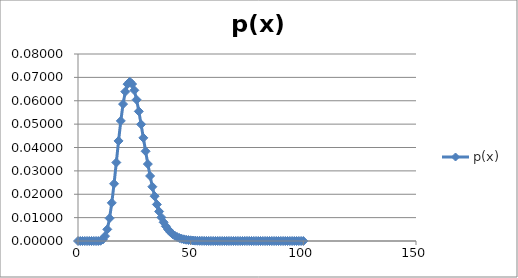
| Category | p(x) |
|---|---|
| 0.0 | 0 |
| 1.0 | 0 |
| 2.0 | 0 |
| 3.0 | 0 |
| 4.0 | 0 |
| 5.0 | 0 |
| 6.0 | 0 |
| 7.0 | 0 |
| 8.0 | 0 |
| 9.0 | 0 |
| 10.0 | 0 |
| 11.0 | 0.001 |
| 12.0 | 0.002 |
| 13.0 | 0.005 |
| 14.0 | 0.01 |
| 15.0 | 0.016 |
| 16.0 | 0.024 |
| 17.0 | 0.034 |
| 18.0 | 0.043 |
| 19.0 | 0.051 |
| 20.0 | 0.059 |
| 21.0 | 0.064 |
| 22.0 | 0.067 |
| 23.0 | 0.068 |
| 24.0 | 0.067 |
| 25.0 | 0.064 |
| 26.0 | 0.06 |
| 27.0 | 0.055 |
| 28.0 | 0.05 |
| 29.0 | 0.044 |
| 30.0 | 0.038 |
| 31.0 | 0.033 |
| 32.0 | 0.028 |
| 33.0 | 0.023 |
| 34.0 | 0.019 |
| 35.0 | 0.016 |
| 36.0 | 0.013 |
| 37.0 | 0.01 |
| 38.0 | 0.008 |
| 39.0 | 0.006 |
| 40.0 | 0.005 |
| 41.0 | 0.004 |
| 42.0 | 0.003 |
| 43.0 | 0.002 |
| 44.0 | 0.002 |
| 45.0 | 0.001 |
| 46.0 | 0.001 |
| 47.0 | 0.001 |
| 48.0 | 0.001 |
| 49.0 | 0 |
| 50.0 | 0 |
| 51.0 | 0 |
| 52.0 | 0 |
| 53.0 | 0 |
| 54.0 | 0 |
| 55.0 | 0 |
| 56.0 | 0 |
| 57.0 | 0 |
| 58.0 | 0 |
| 59.0 | 0 |
| 60.0 | 0 |
| 61.0 | 0 |
| 62.0 | 0 |
| 63.0 | 0 |
| 64.0 | 0 |
| 65.0 | 0 |
| 66.0 | 0 |
| 67.0 | 0 |
| 68.0 | 0 |
| 69.0 | 0 |
| 70.0 | 0 |
| 71.0 | 0 |
| 72.0 | 0 |
| 73.0 | 0 |
| 74.0 | 0 |
| 75.0 | 0 |
| 76.0 | 0 |
| 77.0 | 0 |
| 78.0 | 0 |
| 79.0 | 0 |
| 80.0 | 0 |
| 81.0 | 0 |
| 82.0 | 0 |
| 83.0 | 0 |
| 84.0 | 0 |
| 85.0 | 0 |
| 86.0 | 0 |
| 87.0 | 0 |
| 88.0 | 0 |
| 89.0 | 0 |
| 90.0 | 0 |
| 91.0 | 0 |
| 92.0 | 0 |
| 93.0 | 0 |
| 94.0 | 0 |
| 95.0 | 0 |
| 96.0 | 0 |
| 97.0 | 0 |
| 98.0 | 0 |
| 99.0 | 0 |
| 100.0 | 0 |